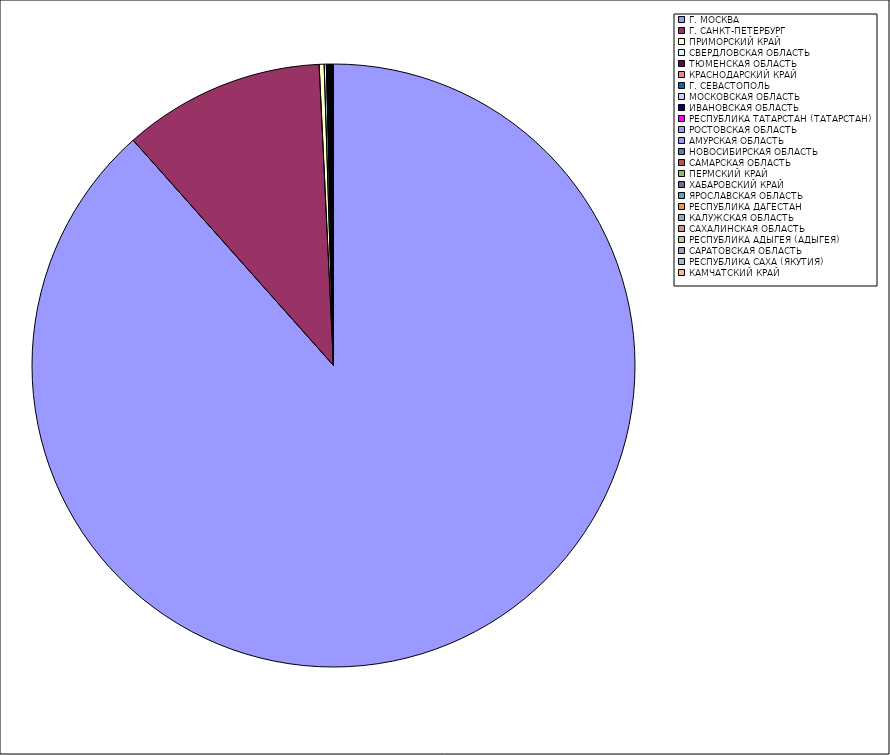
| Category | Оборот |
|---|---|
| Г. МОСКВА | 88.383 |
| Г. САНКТ-ПЕТЕРБУРГ | 10.805 |
| ПРИМОРСКИЙ КРАЙ | 0.265 |
| СВЕРДЛОВСКАЯ ОБЛАСТЬ | 0.115 |
| ТЮМЕНСКАЯ ОБЛАСТЬ | 0.045 |
| КРАСНОДАРСКИЙ КРАЙ | 0.045 |
| Г. СЕВАСТОПОЛЬ | 0.041 |
| МОСКОВСКАЯ ОБЛАСТЬ | 0.031 |
| ИВАНОВСКАЯ ОБЛАСТЬ | 0.027 |
| РЕСПУБЛИКА ТАТАРСТАН (ТАТАРСТАН) | 0.025 |
| РОСТОВСКАЯ ОБЛАСТЬ | 0.02 |
| АМУРСКАЯ ОБЛАСТЬ | 0.017 |
| НОВОСИБИРСКАЯ ОБЛАСТЬ | 0.016 |
| САМАРСКАЯ ОБЛАСТЬ | 0.016 |
| ПЕРМСКИЙ КРАЙ | 0.016 |
| ХАБАРОВСКИЙ КРАЙ | 0.012 |
| ЯРОСЛАВСКАЯ ОБЛАСТЬ | 0.012 |
| РЕСПУБЛИКА ДАГЕСТАН | 0.01 |
| КАЛУЖСКАЯ ОБЛАСТЬ | 0.009 |
| САХАЛИНСКАЯ ОБЛАСТЬ | 0.008 |
| РЕСПУБЛИКА АДЫГЕЯ (АДЫГЕЯ) | 0.008 |
| САРАТОВСКАЯ ОБЛАСТЬ | 0.008 |
| РЕСПУБЛИКА САХА (ЯКУТИЯ) | 0.007 |
| КАМЧАТСКИЙ КРАЙ | 0.006 |